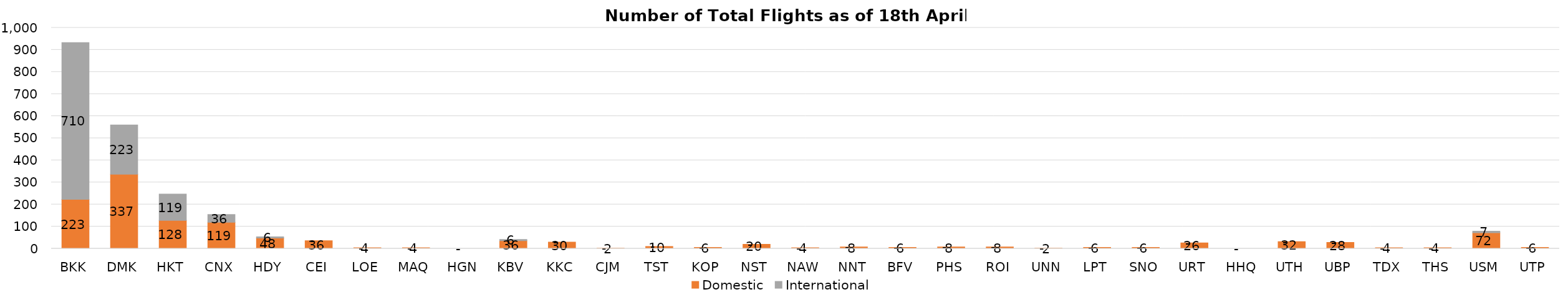
| Category | Domestic | International |
|---|---|---|
| BKK | 223 | 710 |
| DMK | 337 | 223 |
| HKT | 128 | 119 |
| CNX | 119 | 36 |
| HDY | 48 | 6 |
| CEI | 36 | 0 |
| LOE | 4 | 0 |
| MAQ | 4 | 0 |
| HGN | 0 | 0 |
| KBV | 36 | 6 |
| KKC | 30 | 0 |
| CJM | 2 | 0 |
| TST | 10 | 0 |
| KOP | 6 | 0 |
| NST | 20 | 0 |
| NAW | 4 | 0 |
| NNT | 8 | 0 |
| BFV | 6 | 0 |
| PHS | 8 | 0 |
| ROI | 8 | 0 |
| UNN | 2 | 0 |
| LPT | 6 | 0 |
| SNO | 6 | 0 |
| URT | 26 | 0 |
| HHQ | 0 | 0 |
| UTH | 32 | 0 |
| UBP | 28 | 0 |
| TDX | 4 | 0 |
| THS | 4 | 0 |
| USM | 72 | 7 |
| UTP | 6 | 0 |